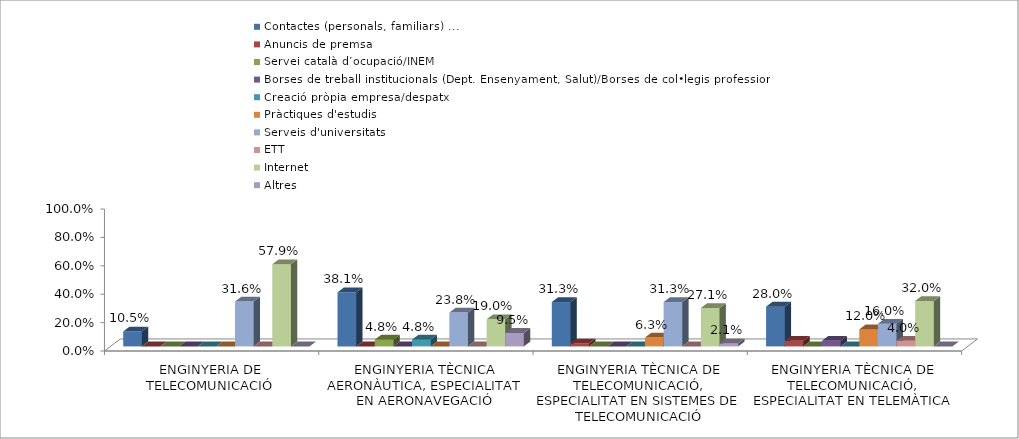
| Category | Contactes (personals, familiars) ... | Anuncis de premsa | Servei català d’ocupació/INEM | Borses de treball institucionals (Dept. Ensenyament, Salut)/Borses de col•legis professionals | Creació pròpia empresa/despatx | Pràctiques d'estudis | Serveis d'universitats | ETT | Internet | Altres |
|---|---|---|---|---|---|---|---|---|---|---|
| ENGINYERIA DE TELECOMUNICACIÓ | 0.105 | 0 | 0 | 0 | 0 | 0 | 0.316 | 0 | 0.579 | 0 |
| ENGINYERIA TÈCNICA AERONÀUTICA, ESPECIALITAT EN AERONAVEGACIÓ | 0.381 | 0 | 0.048 | 0 | 0.048 | 0 | 0.238 | 0 | 0.19 | 0.095 |
| ENGINYERIA TÈCNICA DE TELECOMUNICACIÓ, ESPECIALITAT EN SISTEMES DE TELECOMUNICACIÓ | 0.312 | 0.021 | 0 | 0 | 0 | 0.062 | 0.312 | 0 | 0.271 | 0.021 |
| ENGINYERIA TÈCNICA DE TELECOMUNICACIÓ, ESPECIALITAT EN TELEMÀTICA | 0.28 | 0.04 | 0 | 0.04 | 0 | 0.12 | 0.16 | 0.04 | 0.32 | 0 |